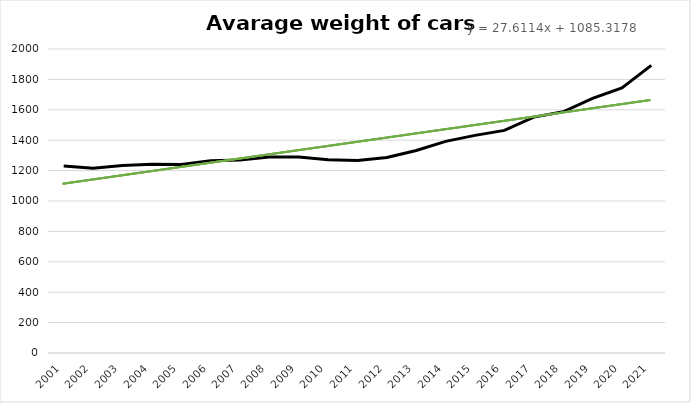
| Category | Series 0 |
|---|---|
| 2001.0 | 1230.058 |
| 2002.0 | 1214.851 |
| 2003.0 | 1232.953 |
| 2004.0 | 1242.24 |
| 2005.0 | 1240.219 |
| 2006.0 | 1264.297 |
| 2007.0 | 1269.639 |
| 2008.0 | 1289.549 |
| 2009.0 | 1290.053 |
| 2010.0 | 1271.79 |
| 2011.0 | 1267.198 |
| 2012.0 | 1285.993 |
| 2013.0 | 1332.522 |
| 2014.0 | 1392.106 |
| 2015.0 | 1431.84 |
| 2016.0 | 1464.394 |
| 2017.0 | 1551.901 |
| 2018.0 | 1587.062 |
| 2019.0 | 1674.777 |
| 2020.0 | 1744.176 |
| 2021.0 | 1892.29 |